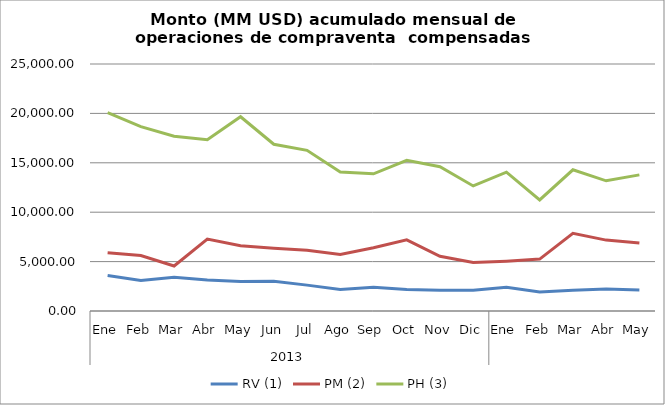
| Category | RV (1) | PM (2) | PH (3) |
|---|---|---|---|
| 0 | 3582.113 | 5901.651 | 20087.034 |
| 1 | 3086.223 | 5614.086 | 18662.914 |
| 2 | 3427.503 | 4559.027 | 17696.541 |
| 3 | 3146.302 | 7279.906 | 17332.385 |
| 4 | 2992.826 | 6596.857 | 19663.42 |
| 5 | 3012.804 | 6346.526 | 16878.408 |
| 6 | 2618.878 | 6139.885 | 16263.385 |
| 7 | 2182.732 | 5724.829 | 14069.305 |
| 8 | 2409.674 | 6399.577 | 13889.23 |
| 9 | 2180.079 | 7195.606 | 15254.774 |
| 10 | 2095.442 | 5541.836 | 14598.61 |
| 11 | 2104.88 | 4905.995 | 12657.524 |
| 12 | 2410.581 | 5047.1 | 14052.921 |
| 13 | 1913.3 | 5251.955 | 11240.27 |
| 14 | 2111.981 | 7861.413 | 14290.324 |
| 15 | 2223.473 | 7175.644 | 13176.799 |
| 16 | 2125.013 | 6892.343 | 13776.518 |